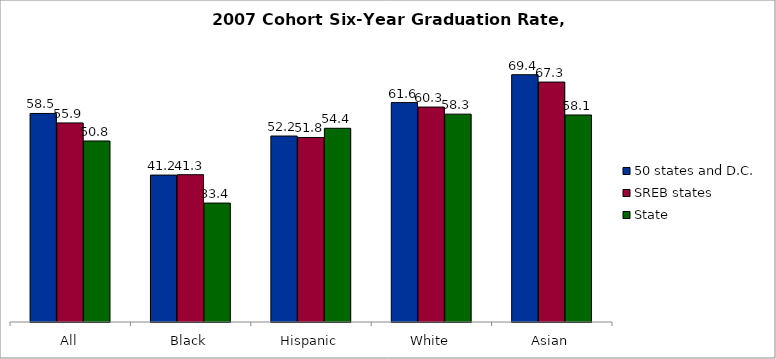
| Category | 50 states and D.C. | SREB states | State |
|---|---|---|---|
| All | 58.542 | 55.885 | 50.814 |
| Black | 41.241 | 41.349 | 33.384 |
| Hispanic | 52.202 | 51.796 | 54.377 |
| White | 61.591 | 60.333 | 58.347 |
| Asian | 69.416 | 67.347 | 58.112 |